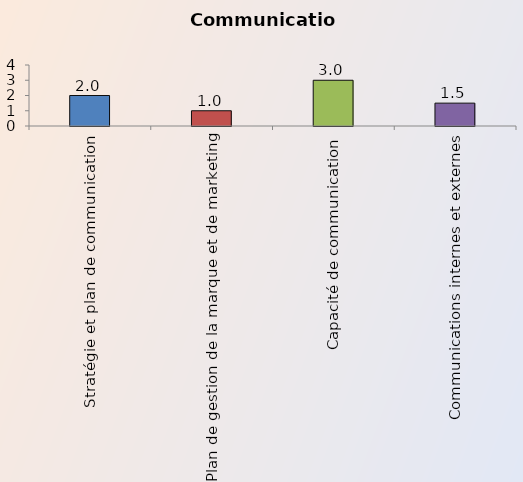
| Category | Series 0 |
|---|---|
| Stratégie et plan de communication | 2 |
| Plan de gestion de la marque et de marketing | 1 |
| Capacité de communication | 3 |
| Communications internes et externes | 1.5 |